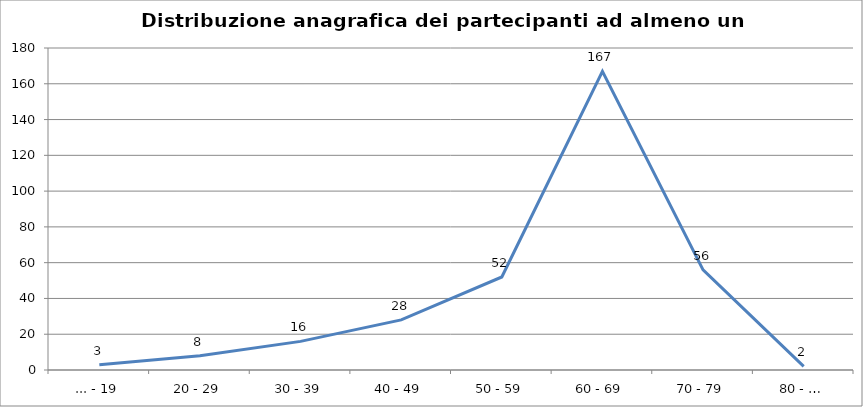
| Category | Nr. Tesserati |
|---|---|
| ... - 19 | 3 |
| 20 - 29 | 8 |
| 30 - 39 | 16 |
| 40 - 49 | 28 |
| 50 - 59 | 52 |
| 60 - 69 | 167 |
| 70 - 79 | 56 |
| 80 - … | 2 |